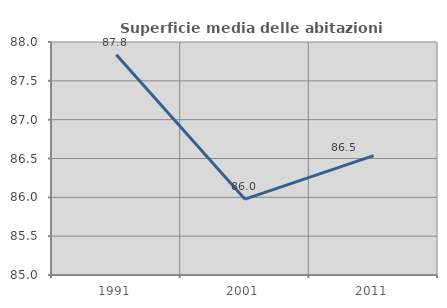
| Category | Superficie media delle abitazioni occupate |
|---|---|
| 1991.0 | 87.835 |
| 2001.0 | 85.977 |
| 2011.0 | 86.538 |